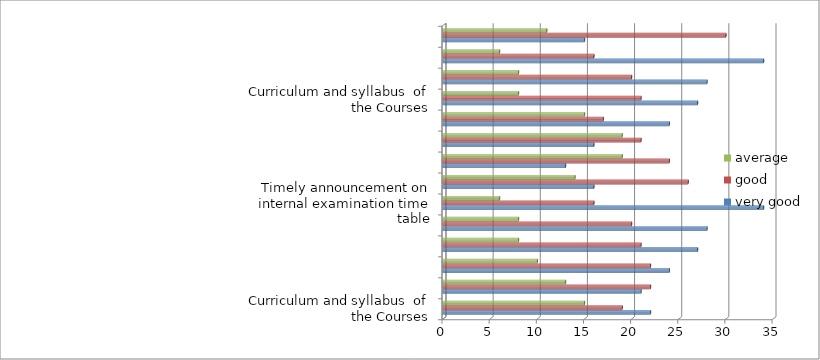
| Category | very good | good | average |
|---|---|---|---|
| Curriculum and syllabus  of the Courses | 22 | 19 | 15 |
| Extent of syllabus covered in the class | 21 | 22 | 13 |
| Courses delivery by faculty members in the class | 24 | 22 | 10 |
| Usage of teaching aids and ICT in the class | 27 | 21 | 8 |
| Fairness in the assessment Process | 28 | 20 | 8 |
| Timely announcement on internal examination time table | 34 | 16 | 6 |
| Opportunities available in the college for best practices/ other activities | 16 | 26 | 14 |
| Opportunities available in the college for students to participate in internship, field visits etc. | 13 | 24 | 19 |
| Opportunities for out of class room learning eg. Guest lectures, Seminars, Workshop Value aided Programmes, Conferences, competitions etc. | 16 | 21 | 19 |
| Overall Learning Experience | 24 | 17 | 15 |
| Curriculum and syllabus  of the Courses | 27 | 21 | 8 |
| Extent of syllabus covered in the class | 28 | 20 | 8 |
| Courses delivery by faculty members in the class | 34 | 16 | 6 |
| Usage of teaching aids and ICT in the class | 15 | 30 | 11 |